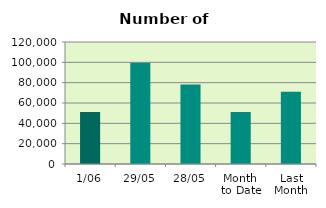
| Category | Series 0 |
|---|---|
| 1/06 | 51062 |
| 29/05 | 99534 |
| 28/05 | 78308 |
| Month 
to Date | 51062 |
| Last
Month | 71072.3 |